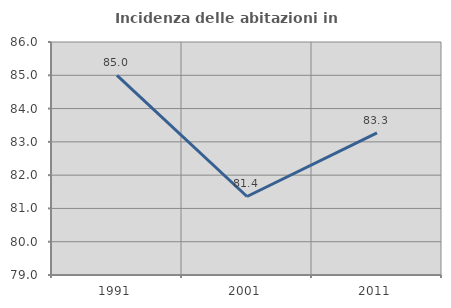
| Category | Incidenza delle abitazioni in proprietà  |
|---|---|
| 1991.0 | 85 |
| 2001.0 | 81.359 |
| 2011.0 | 83.271 |